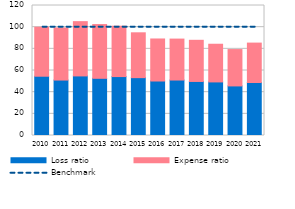
| Category | Loss ratio | Expense ratio |
|---|---|---|
| 2010.0 | 54.72 | 45.23 |
| 2011.0 | 51.18 | 48.09 |
| 2012.0 | 55 | 50.1 |
| 2013.0 | 52.8 | 49.6 |
| 2014.0 | 54.4 | 46.5 |
| 2015.0 | 53.4 | 41.4 |
| 2016.0 | 50.3 | 38.8 |
| 2017.0 | 51.2 | 37.8 |
| 2018.0 | 49.89 | 37.99 |
| 2019.0 | 49.46 | 34.78 |
| 2020.0 | 45.77 | 33.56 |
| 2021.0 | 48.9 | 36.4 |